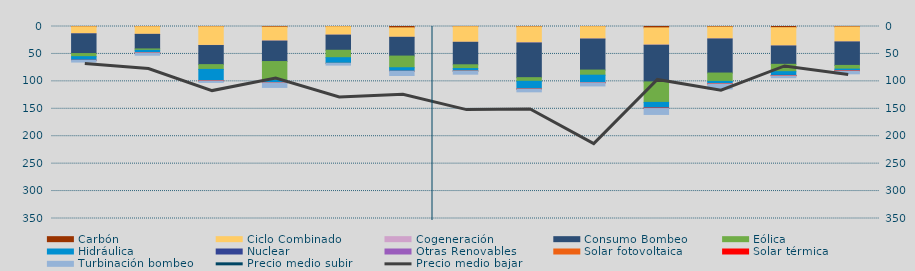
| Category | Carbón | Ciclo Combinado | Cogeneración | Consumo Bombeo | Eólica | Hidráulica | Nuclear | Otras Renovables | Solar fotovoltaica | Solar térmica | Turbinación bombeo |
|---|---|---|---|---|---|---|---|---|---|---|---|
| J | 443.9 | 12856.8 | 51.4 | 35974.9 | 5660.8 | 6548.3 | 0 | 0 | 0 | 36.3 | 3239.8 |
| A | 358.3 | 13944.3 | 52.2 | 26551 | 2617.8 | 4480.2 | 0 | 0 | 4.2 | 28.6 | 4317.4 |
| S | 432.5 | 33982.7 | 275.4 | 34800.5 | 8747.7 | 20855.2 | 39.1 | 0 | 120.5 | 16.9 | 2614.1 |
| O | 1070.2 | 25365.1 | 217.3 | 37208.4 | 34251.5 | 4376.1 | 0 | 0 | 112 | 4.5 | 8448.7 |
| N | 341.2 | 15370.8 | 69.7 | 27553.5 | 13534.1 | 10283 | 0 | 0 | 11.9 | 0 | 3198.9 |
| D | 2480.9 | 17195.4 | 77 | 34176.7 | 21256.4 | 6504.8 | 0 | 19.8 | 89.3 | 0 | 7509.1 |
| E | 386 | 28336.3 | 129.1 | 40939.4 | 6907.9 | 4462.9 | 34.4 | 0 | 32.7 | 0 | 5705.4 |
| F | 596.6 | 29112.7 | 204.1 | 63351.9 | 6588.8 | 14242.2 | 0 | 0 | 6.8 | 5.7 | 5009.4 |
| M | 303.5 | 22485.8 | 115.8 | 56511.7 | 9357.1 | 13652.7 | 0 | 45.9 | 36.9 | 12.5 | 5840.6 |
| A | 2494.9 | 31290.063 | 376.8 | 66847.891 | 37361.887 | 10548.549 | 58.3 | 29.1 | 101.167 | 483.9 | 10705.8 |
| M | 916.05 | 21695.666 | 176.35 | 62054.792 | 15250.739 | 4379.143 | 0 | 39.1 | 143.784 | 110.5 | 9070.525 |
| J | 2154.975 | 33372.05 | 35.5 | 33404.025 | 13344.6 | 6713.425 | 395.875 | 16.375 | 385.65 | 221.25 | 3231.725 |
| J | 780.225 | 27400.075 | 8 | 42750.35 | 6759.125 | 3263.775 | 115 | 0 | 90.1 | 206.65 | 4895.275 |